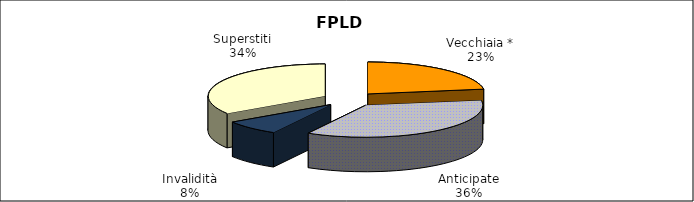
| Category | Series 0 |
|---|---|
| Vecchiaia * | 59664 |
| Anticipate | 93809 |
| Invalidità | 20321 |
| Superstiti | 90268 |